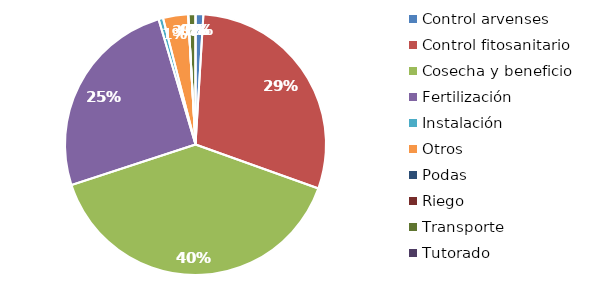
| Category | Valor |
|---|---|
| Control arvenses | 834960 |
| Control fitosanitario | 25469895 |
| Cosecha y beneficio | 34103874.377 |
| Fertilización | 21989107 |
| Instalación | 482370 |
| Otros | 2682000 |
| Podas | 0 |
| Riego | 0 |
| Transporte | 774250 |
| Tutorado | 0 |